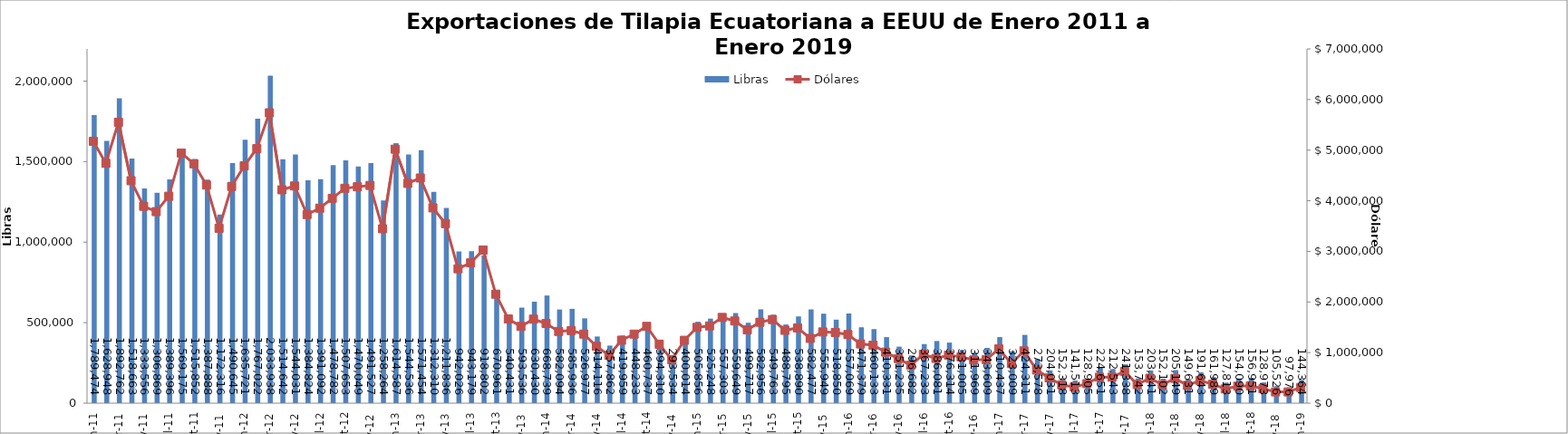
| Category | Libras  |
|---|---|
| 2011-01-01 | 1789473.82 |
| 2011-02-01 | 1628948.076 |
| 2011-03-01 | 1892761.535 |
| 2011-04-01 | 1518662.961 |
| 2011-05-01 | 1333555.926 |
| 2011-06-01 | 1306869.243 |
| 2011-07-01 | 1389396.24 |
| 2011-08-01 | 1569174.756 |
| 2011-09-01 | 1515852.096 |
| 2011-10-01 | 1387888.293 |
| 2011-11-01 | 1172315.891 |
| 2011-12-01 | 1490644.699 |
| 2012-01-01 | 1635720.607 |
| 2012-02-01 | 1767022.174 |
| 2012-03-01 | 2033937.505 |
| 2012-04-01 | 1514641.77 |
| 2012-05-01 | 1544031.293 |
| 2012-06-01 | 1384823.899 |
| 2012-07-01 | 1391091.577 |
| 2012-08-01 | 1478781.747 |
| 2012-09-01 | 1507653.188 |
| 2012-10-01 | 1470049.326 |
| 2012-11-01 | 1491526.539 |
| 2012-12-01 | 1258264 |
| 2013-01-01 | 1614587 |
| 2013-02-01 | 1544536.146 |
| 2013-03-01 | 1571454.312 |
| 2013-04-01 | 1312310.196 |
| 2013-05-01 | 1211835.551 |
| 2013-06-01 | 942025.58 |
| 2013-07-01 | 943178.586 |
| 2013-08-01 | 918802.324 |
| 2013-09-01 | 670961.192 |
| 2013-10-01 | 540431.235 |
| 2013-11-01 | 593535.64 |
| 2013-12-01 | 630429.621 |
| 2014-01-01 | 668739 |
| 2014-02-01 | 582093.766 |
| 2014-03-01 | 585936.383 |
| 2014-04-01 | 526976.561 |
| 2014-05-01 | 414116.473 |
| 2014-06-01 | 357861.695 |
| 2014-07-01 | 419958.663 |
| 2014-08-01 | 448233 |
| 2014-09-01 | 460737.149 |
| 2014-10-01 | 394310.347 |
| 2014-11-01 | 293533.672 |
| 2014-12-01 | 400013.647 |
| 2015-01-01 | 505856.493 |
| 2015-02-01 | 525248 |
| 2015-03-01 | 557303.039 |
| 2015-04-01 | 559648.733 |
| 2015-05-01 | 499716.682 |
| 2015-06-01 | 582955.764 |
| 2015-07-01 | 549763.307 |
| 2015-08-01 | 488795.094 |
| 2015-09-01 | 538890.219 |
| 2015-10-01 | 582477.366 |
| 2015-11-01 | 555949.414 |
| 2015-12-01 | 518850.405 |
| 2016-01-01 | 557069.351 |
| 2016-02-01 | 471378.754 |
| 2016-03-01 | 460133.089 |
| 2016-04-01 | 410331.175 |
| 2016-05-01 | 351235 |
| 2016-06-01 | 296682 |
| 2016-07-01 | 367233.45 |
| 2016-08-01 | 386080.575 |
| 2016-09-01 | 376314.197 |
| 2016-10-01 | 331005.258 |
| 2016-11-01 | 311968.537 |
| 2016-12-01 | 343608.956 |
| 2017-01-01 | 410436.996 |
| 2017-02-01 | 323009.174 |
| 2017-03-01 | 424310.544 |
| 2017-04-01 | 273577.632 |
| 2017-05-01 | 204031.321 |
| 2017-06-01 | 152318.019 |
| 2017-07-01 | 141513.274 |
| 2017-08-01 | 128905.167 |
| 2017-09-01 | 224650.945 |
| 2017-10-01 | 212543.281 |
| 2017-11-01 | 241337.562 |
| 2017-12-01 | 153742.19 |
| 2018-01-01 | 203341.281 |
| 2018-02-01 | 152101.968 |
| 2018-03-01 | 205149.053 |
| 2018-04-01 | 149630.611 |
| 2018-05-01 | 191643 |
| 2018-06-01 | 161989 |
| 2018-07-01 | 127813 |
| 2018-08-01 | 154089.894 |
| 2018-09-01 | 156951.494 |
| 2018-10-01 | 128972.628 |
| 2018-11-01 | 105526.466 |
| 2018-12-01 | 97975.634 |
| 2019-01-01 | 144364.157 |